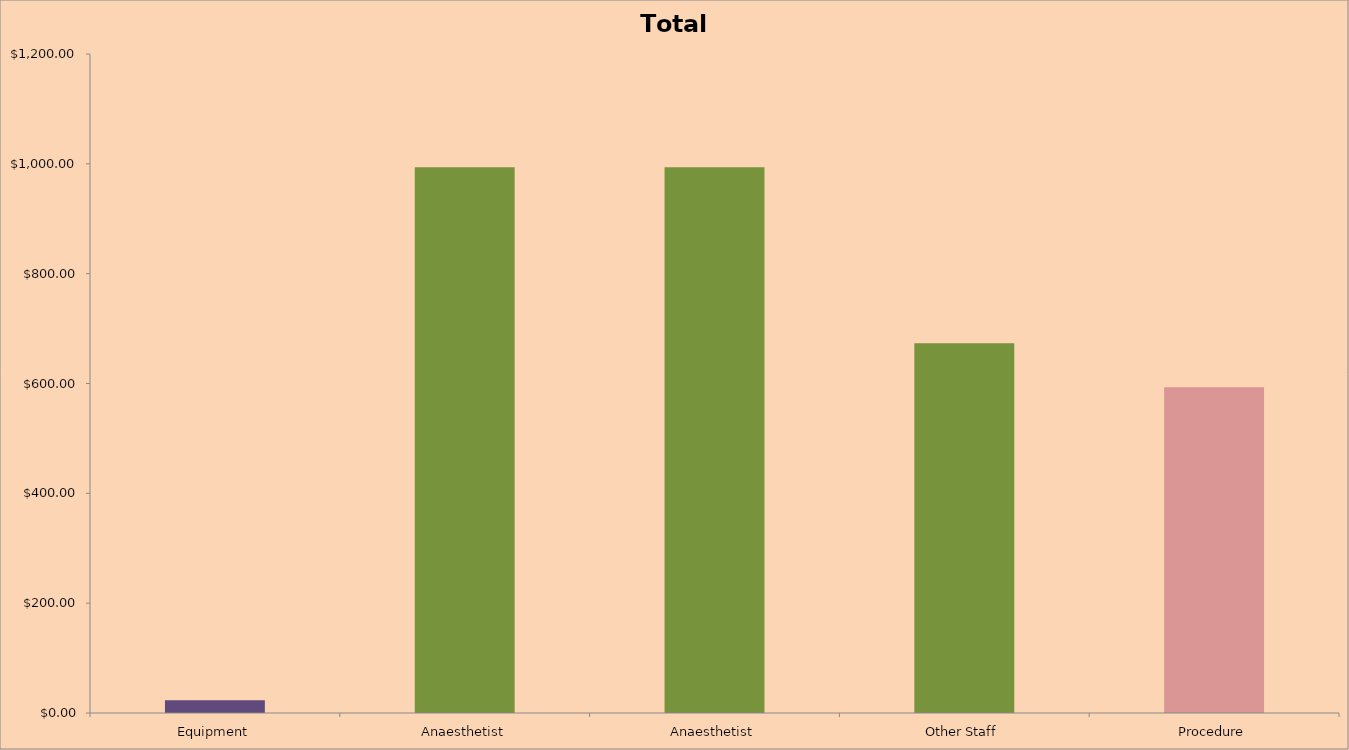
| Category | Series 0 |
|---|---|
| Equipment | 23.272 |
| Anaesthetist | 993.996 |
| Anaesthetist | 993.996 |
| Other Staff | 673.156 |
| Procedure | 593.1 |